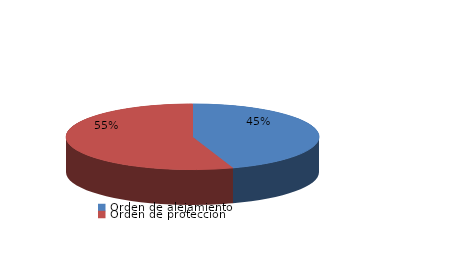
| Category | Series 0 |
|---|---|
| Orden de alejamiento | 13 |
| Orden de protección | 16 |